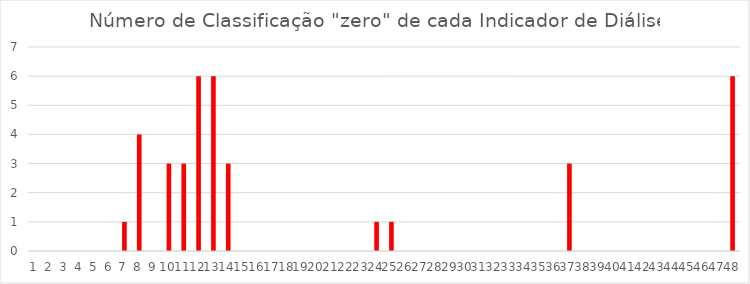
| Category | Series 0 |
|---|---|
| 0 | 0 |
| 1 | 0 |
| 2 | 0 |
| 3 | 0 |
| 4 | 0 |
| 5 | 0 |
| 6 | 1 |
| 7 | 4 |
| 8 | 0 |
| 9 | 3 |
| 10 | 3 |
| 11 | 6 |
| 12 | 6 |
| 13 | 3 |
| 14 | 0 |
| 15 | 0 |
| 16 | 0 |
| 17 | 0 |
| 18 | 0 |
| 19 | 0 |
| 20 | 0 |
| 21 | 0 |
| 22 | 0 |
| 23 | 1 |
| 24 | 1 |
| 25 | 0 |
| 26 | 0 |
| 27 | 0 |
| 28 | 0 |
| 29 | 0 |
| 30 | 0 |
| 31 | 0 |
| 32 | 0 |
| 33 | 0 |
| 34 | 0 |
| 35 | 0 |
| 36 | 3 |
| 37 | 0 |
| 38 | 0 |
| 39 | 0 |
| 40 | 0 |
| 41 | 0 |
| 42 | 0 |
| 43 | 0 |
| 44 | 0 |
| 45 | 0 |
| 46 | 0 |
| 47 | 6 |